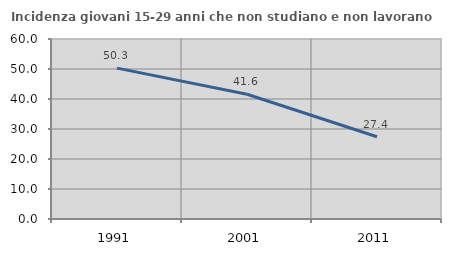
| Category | Incidenza giovani 15-29 anni che non studiano e non lavorano  |
|---|---|
| 1991.0 | 50.293 |
| 2001.0 | 41.598 |
| 2011.0 | 27.429 |